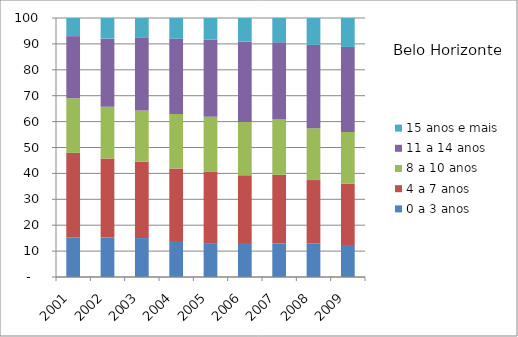
| Category | 0 a 3 anos | 4 a 7 anos | 8 a 10 anos | 11 a 14 anos | 15 anos e mais |
|---|---|---|---|---|---|
| 2001.0 | 15.25 | 32.67 | 21.1 | 23.98 | 7 |
| 2002.0 | 15.23 | 30.54 | 19.97 | 26.29 | 7.97 |
| 2003.0 | 15.03 | 29.48 | 19.78 | 28.01 | 7.71 |
| 2004.0 | 13.92 | 28.02 | 21.01 | 29.11 | 7.94 |
| 2005.0 | 13.06 | 27.63 | 21.14 | 29.78 | 8.39 |
| 2006.0 | 13.12 | 26.12 | 20.63 | 31.1 | 9.03 |
| 2007.0 | 12.94 | 26.52 | 21.58 | 29.55 | 9.41 |
| 2008.0 | 12.89 | 24.54 | 20.01 | 32.18 | 10.38 |
| 2009.0 | 12 | 24.05 | 19.98 | 32.8 | 11.17 |